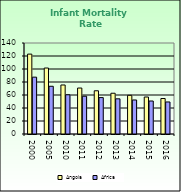
| Category | Angola | Africa |
|---|---|---|
| 2000.0 | 122.9 | 87.462 |
| 2005.0 | 101.5 | 73.418 |
| 2010.0 | 75.4 | 60.345 |
| 2011.0 | 70.7 | 58.107 |
| 2012.0 | 66.5 | 56.032 |
| 2013.0 | 62.7 | 54.131 |
| 2014.0 | 59.5 | 52.336 |
| 2015.0 | 56.9 | 50.754 |
| 2016.0 | 54.6 | 49.283 |